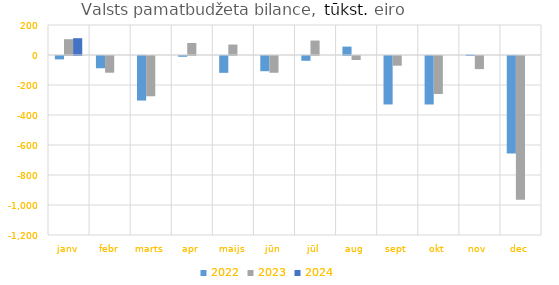
| Category | 2022 | 2023 | 2024 |
|---|---|---|---|
| janv | -22576.613 | 105353.718 | 111979.605 |
| febr | -81631.044 | -111573.897 | 0 |
| marts | -297136.226 | -268446.374 | 0 |
| apr | -5088.903 | 80162.835 | 0 |
| maijs | -112366.131 | 69722.715 | 0 |
| jūn | -101334.812 | -111818.831 | 0 |
| jūl | -31986.255 | 96437.577 | 0 |
| aug | 56068.97 | -26561.409 | 0 |
| sept | -323095.809 | -64729.897 | 0 |
| okt | -323290.39 | -253457.177 | 0 |
| nov | 2508.419 | -87529.517 | 0 |
| dec | -649319.296 | -958560.445 | 0 |